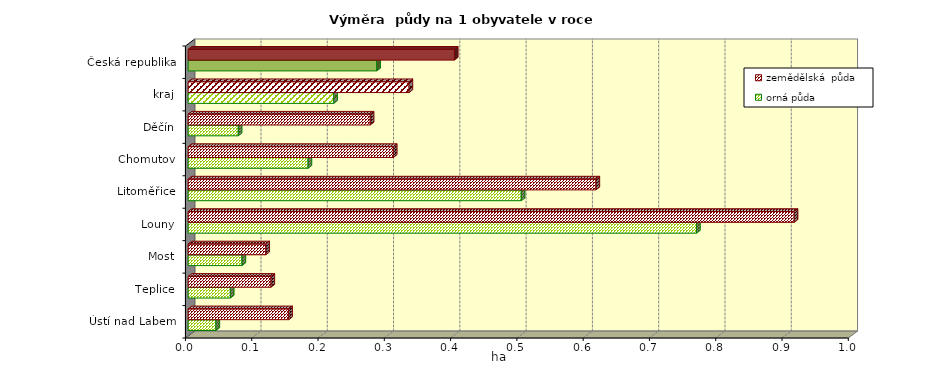
| Category | orná půda | zemědělská  půda |
|---|---|---|
| Ústí nad Labem | 0.042 | 0.152 |
| Teplice | 0.064 | 0.125 |
| Most | 0.081 | 0.117 |
| Louny | 0.767 | 0.914 |
| Litoměřice | 0.503 | 0.615 |
| Chomutov | 0.181 | 0.31 |
| Děčín | 0.076 | 0.275 |
| kraj | 0.22 | 0.333 |
| Česká republika | 0.285 | 0.402 |